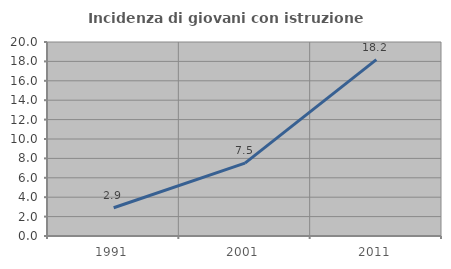
| Category | Incidenza di giovani con istruzione universitaria |
|---|---|
| 1991.0 | 2.913 |
| 2001.0 | 7.519 |
| 2011.0 | 18.182 |